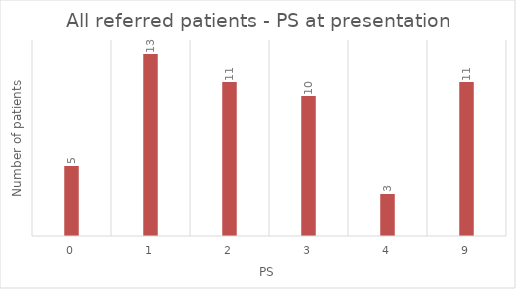
| Category | Series 1 |
|---|---|
| 0.0 | 5 |
| 1.0 | 13 |
| 2.0 | 11 |
| 3.0 | 10 |
| 4.0 | 3 |
| 9.0 | 11 |